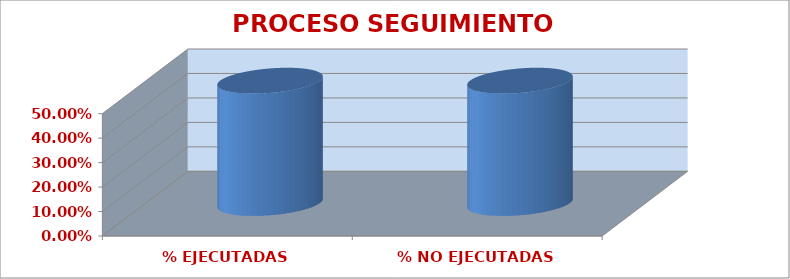
| Category | PROCESO SEGUIMIENTO ACADÉMICO |
|---|---|
| % EJECUTADAS | 0.5 |
| % NO EJECUTADAS | 0.5 |